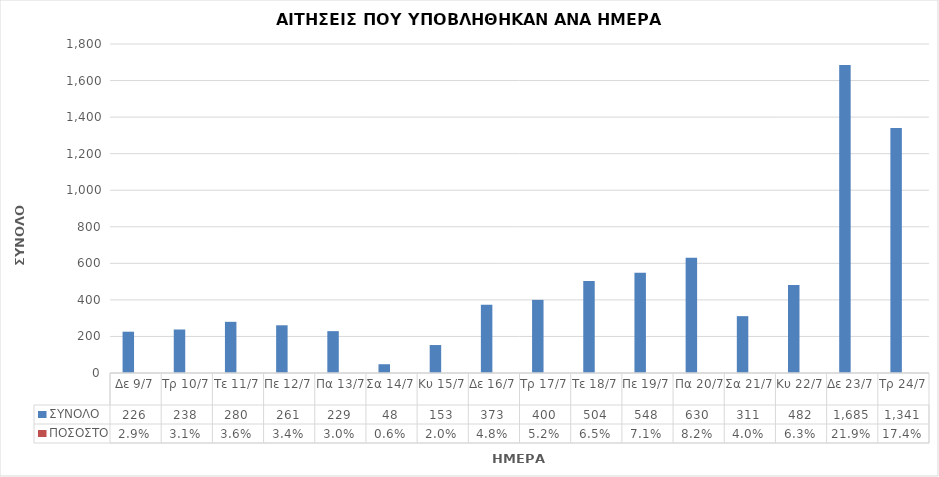
| Category | ΣΥΝΟΛΟ | ΠΟΣΟΣΤΟ |
|---|---|---|
| Δε 9/7 | 226 | 0.029 |
| Τρ 10/7 | 238 | 0.031 |
| Τε 11/7 | 280 | 0.036 |
| Πε 12/7 | 261 | 0.034 |
| Πα 13/7 | 229 | 0.03 |
| Σα 14/7 | 48 | 0.006 |
| Κυ 15/7 | 153 | 0.02 |
| Δε 16/7 | 373 | 0.048 |
| Τρ 17/7 | 400 | 0.052 |
| Τε 18/7 | 504 | 0.065 |
| Πε 19/7 | 548 | 0.071 |
| Πα 20/7 | 630 | 0.082 |
| Σα 21/7 | 311 | 0.04 |
| Κυ 22/7 | 482 | 0.063 |
| Δε 23/7 | 1685 | 0.219 |
| Τρ 24/7 | 1341 | 0.174 |